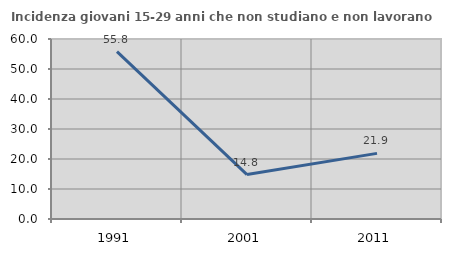
| Category | Incidenza giovani 15-29 anni che non studiano e non lavorano  |
|---|---|
| 1991.0 | 55.808 |
| 2001.0 | 14.815 |
| 2011.0 | 21.875 |